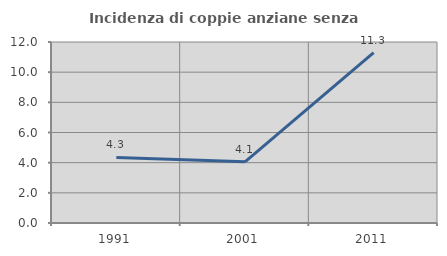
| Category | Incidenza di coppie anziane senza figli  |
|---|---|
| 1991.0 | 4.348 |
| 2001.0 | 4.054 |
| 2011.0 | 11.29 |